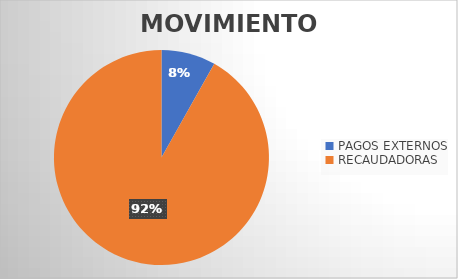
| Category | MOVIMIENTOS |
|---|---|
| PAGOS EXTERNOS | 8259 |
| RECAUDADORAS | 92805 |